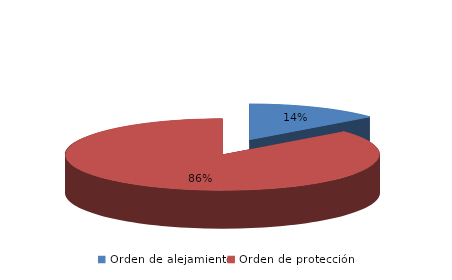
| Category | Series 0 |
|---|---|
| Orden de alejamiento | 814 |
| Orden de protección | 5049 |